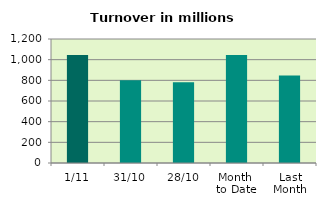
| Category | Series 0 |
|---|---|
| 1/11 | 1044.007 |
| 31/10 | 800.506 |
| 28/10 | 782.139 |
| Month 
to Date | 1044.007 |
| Last
Month | 847.422 |